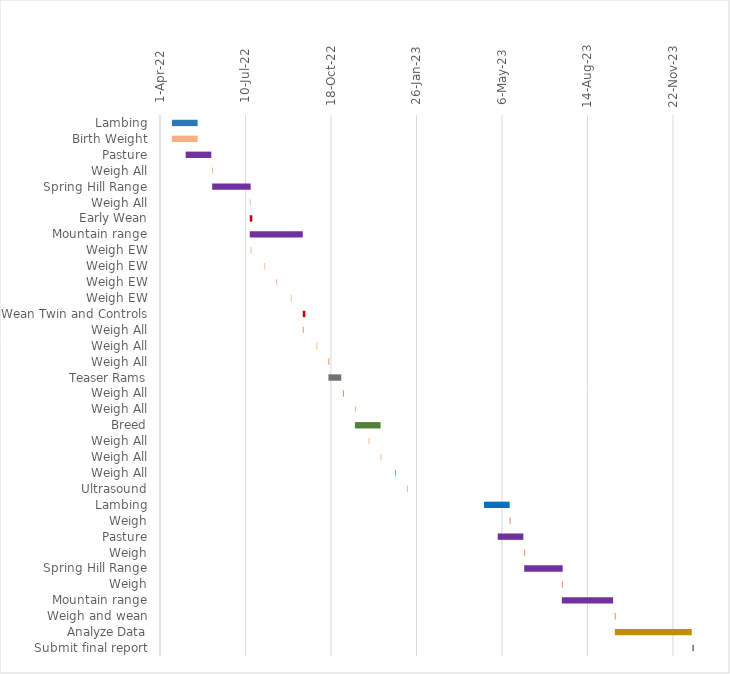
| Category | 15-Apr-22 | Duration (days) |
|---|---|---|
| Lambing | 2022-04-15 | 30 |
| Birth Weight | 2022-04-15 | 30 |
| Pasture | 2022-05-01 | 30 |
| Weigh All | 2022-06-01 | 1 |
| Spring Hill Range | 2022-06-01 | 45 |
| Weigh All | 2022-07-15 | 1 |
| Early Wean | 2022-07-15 | 3 |
| Mountain range | 2022-07-15 | 62 |
| Weigh EW | 2022-07-16 | 1 |
| Weigh EW | 2022-08-01 | 1 |
| Weigh EW | 2022-08-15 | 1 |
| Weigh EW | 2022-09-01 | 1 |
| Wean Twin and Controls | 2022-09-15 | 3 |
| Weigh All | 2022-09-15 | 1 |
| Weigh All | 2022-10-01 | 1 |
| Weigh All | 2022-10-15 | 1 |
| Teaser Rams | 2022-10-15 | 15 |
| Weigh All | 2022-11-01 | 1 |
| Weigh All | 2022-11-15 | 1 |
| Breed | 2022-11-15 | 30 |
| Weigh All | 2022-12-01 | 1 |
| Weigh All | 2022-12-15 | 1 |
| Weigh All | 2023-01-01 | 1 |
| Ultrasound | 2023-01-15 | 1 |
| Lambing | 2023-04-15 | 30 |
| Weigh | 2023-05-15 | 1 |
| Pasture | 2023-05-01 | 30 |
| Weigh | 2023-06-01 | 1 |
| Spring Hill Range | 2023-06-01 | 45 |
| Weigh | 2023-07-15 | 1 |
| Mountain range | 2023-07-15 | 60 |
| Weigh and wean | 2023-09-15 | 1 |
| Analyze Data | 2023-09-15 | 90 |
| Submit final report | 2023-12-15 | 1 |